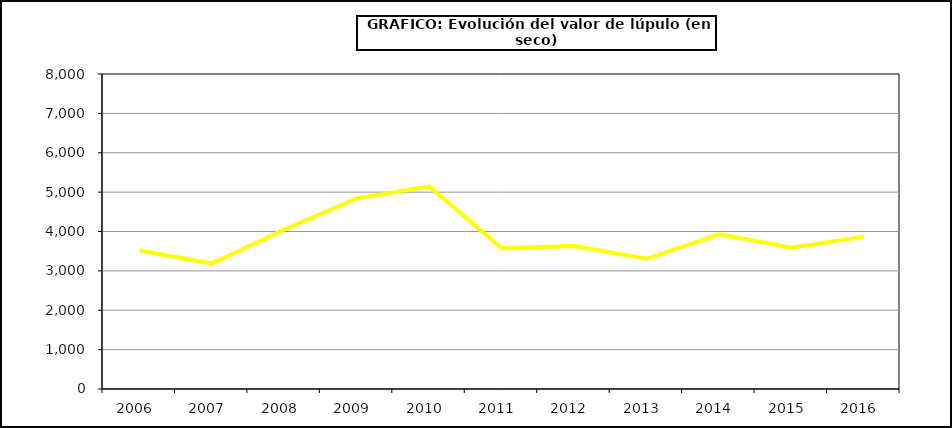
| Category | Valor |
|---|---|
| 2006.0 | 3518.5 |
| 2007.0 | 3185.28 |
| 2008.0 | 4045.86 |
| 2009.0 | 4841.88 |
| 2010.0 | 5145.68 |
| 2011.0 | 3575.44 |
| 2012.0 | 3629.5 |
| 2013.0 | 3307.08 |
| 2014.0 | 3927.8 |
| 2015.0 | 3588 |
| 2016.0 | 3870 |